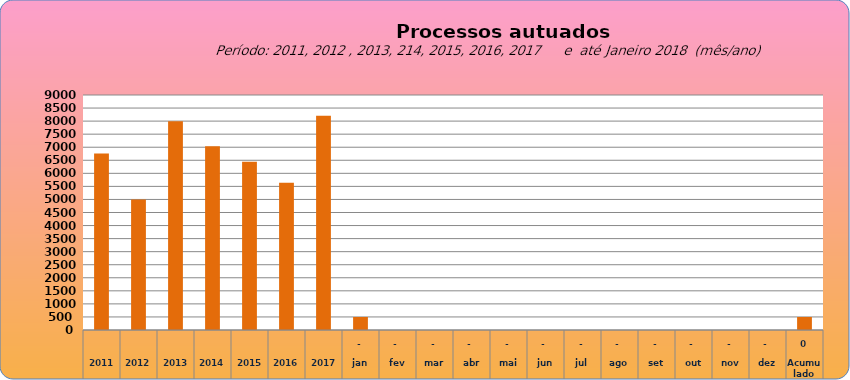
| Category | 6755 |
|---|---|
| 2011 | 6755 |
| 2012 | 4997 |
| 2013 | 7990 |
| 2014 | 7034 |
| 2015 | 6446 |
| 2016 | 5644 |
| 2017 | 8210 |
| jan | 498 |
| fev | 0 |
| mar | 0 |
| abr | 0 |
| mai | 0 |
| jun | 0 |
| jul | 0 |
| ago | 0 |
| set | 0 |
| out | 0 |
| nov | 0 |
| dez | 0 |
| Acumulado
 | 498 |